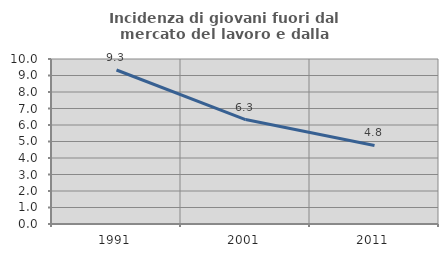
| Category | Incidenza di giovani fuori dal mercato del lavoro e dalla formazione  |
|---|---|
| 1991.0 | 9.333 |
| 2001.0 | 6.329 |
| 2011.0 | 4.762 |